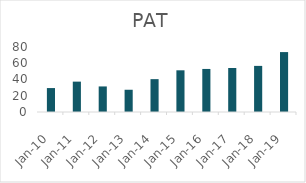
| Category | PAT |
|---|---|
| 2010-03-31 | 29.46 |
| 2011-03-31 | 37.38 |
| 2012-03-31 | 31.46 |
| 2013-03-31 | 27.38 |
| 2014-03-31 | 40.44 |
| 2015-03-31 | 51.32 |
| 2016-03-31 | 52.99 |
| 2017-03-31 | 54.17 |
| 2018-03-31 | 56.75 |
| 2019-03-31 | 73.74 |